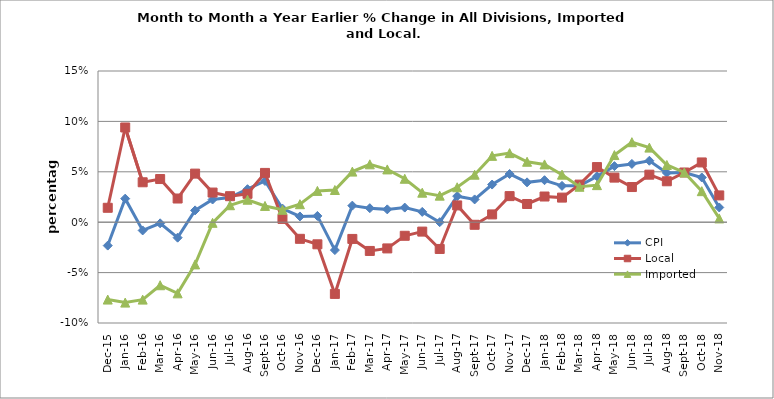
| Category | CPI | Local | Imported |
|---|---|---|---|
| 2015-12-01 | -0.023 | 0.014 | -0.077 |
| 2016-01-01 | 0.023 | 0.094 | -0.08 |
| 2016-02-01 | -0.008 | 0.04 | -0.077 |
| 2016-03-01 | -0.001 | 0.043 | -0.063 |
| 2016-04-01 | -0.015 | 0.023 | -0.071 |
| 2016-05-01 | 0.012 | 0.048 | -0.042 |
| 2016-06-01 | 0.023 | 0.029 | -0.001 |
| 2016-07-01 | 0.025 | 0.026 | 0.017 |
| 2016-08-01 | 0.033 | 0.028 | 0.022 |
| 2016-09-01 | 0.041 | 0.049 | 0.016 |
| 2016-10-01 | 0.014 | 0.003 | 0.012 |
| 2016-11-01 | 0.006 | -0.016 | 0.018 |
| 2016-12-01 | 0.006 | -0.022 | 0.031 |
| 2017-01-01 | -0.028 | -0.071 | 0.032 |
| 2017-02-01 | 0.016 | -0.017 | 0.05 |
| 2017-03-01 | 0.014 | -0.029 | 0.057 |
| 2017-04-01 | 0.013 | -0.026 | 0.052 |
| 2017-05-01 | 0.015 | -0.013 | 0.043 |
| 2017-06-01 | 0.01 | -0.009 | 0.029 |
| 2017-07-01 | 0 | -0.027 | 0.026 |
| 2017-08-01 | 0.026 | 0.017 | 0.035 |
| 2017-09-01 | 0.023 | -0.003 | 0.047 |
| 2017-10-01 | 0.037 | 0.008 | 0.066 |
| 2017-11-01 | 0.048 | 0.026 | 0.069 |
| 2017-12-01 | 0.04 | 0.018 | 0.06 |
| 2018-01-01 | 0.042 | 0.025 | 0.057 |
| 2018-02-01 | 0.036 | 0.024 | 0.047 |
| 2018-03-01 | 0.036 | 0.037 | 0.035 |
| 2018-04-01 | 0.045 | 0.055 | 0.037 |
| 2018-05-01 | 0.056 | 0.044 | 0.067 |
| 2018-06-01 | 0.058 | 0.035 | 0.079 |
| 2018-07-01 | 0.061 | 0.047 | 0.074 |
| 2018-08-01 | 0.049 | 0.041 | 0.057 |
| 2018-09-01 | 0.049 | 0.049 | 0.049 |
| 2018-10-01 | 0.044 | 0.059 | 0.031 |
| 2018-11-01 | 0.015 | 0.027 | 0.004 |